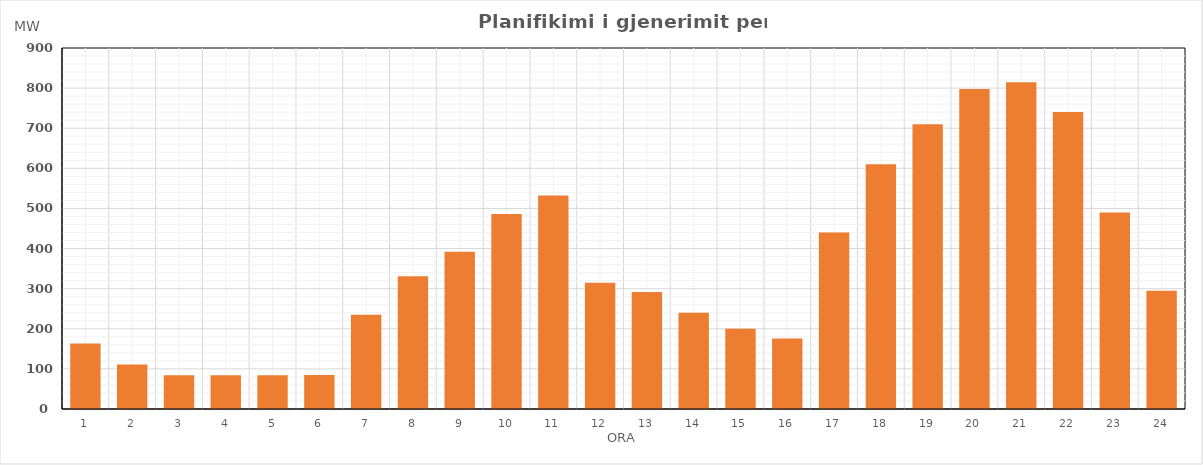
| Category | Max (MW) |
|---|---|
| 0 | 163.313 |
| 1 | 111.011 |
| 2 | 83.899 |
| 3 | 83.9 |
| 4 | 83.9 |
| 5 | 84.74 |
| 6 | 234.9 |
| 7 | 330.9 |
| 8 | 391.9 |
| 9 | 485.9 |
| 10 | 532.359 |
| 11 | 314.9 |
| 12 | 291.811 |
| 13 | 239.844 |
| 14 | 199.9 |
| 15 | 175.9 |
| 16 | 439.796 |
| 17 | 609.934 |
| 18 | 710.187 |
| 19 | 797.817 |
| 20 | 814.788 |
| 21 | 740.234 |
| 22 | 489.9 |
| 23 | 294.9 |